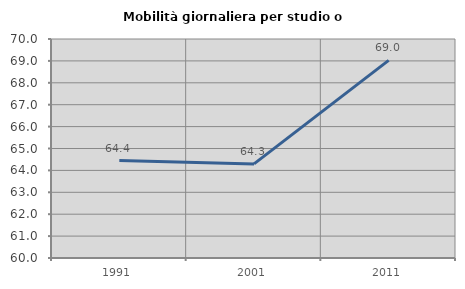
| Category | Mobilità giornaliera per studio o lavoro |
|---|---|
| 1991.0 | 64.447 |
| 2001.0 | 64.296 |
| 2011.0 | 69.024 |